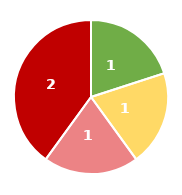
| Category | Series 0 |
|---|---|
| Niedrig | 1 |
| Mittel | 1 |
| Hoch | 1 |
| Kritisch | 2 |